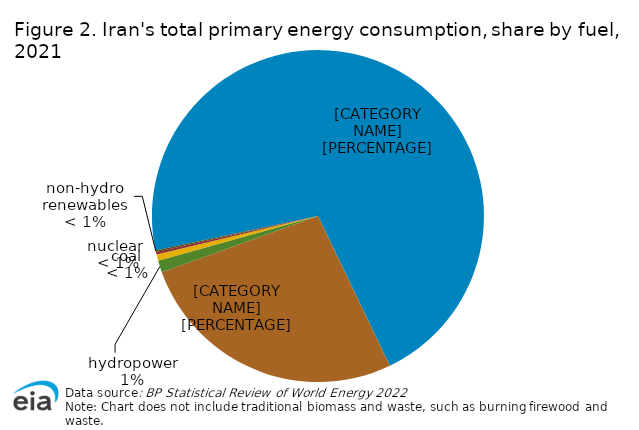
| Category | Series 0 |
|---|---|
| natural gas  | 8.68 |
| petroleum | 3.247 |
| hydropower | 0.14 |
| coal | 0.074 |
| nuclear | 0.032 |
| non-hydro renewables | 0.017 |